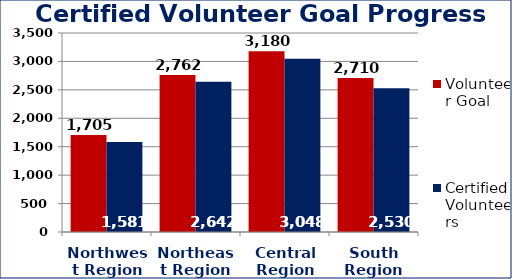
| Category | Volunteer Goal  | Certified Volunteers  |
|---|---|---|
| Northwest Region | 1705 | 1581 |
| Northeast Region | 2762 | 2642 |
| Central Region | 3180 | 3048 |
| South Region | 2710 | 2530 |